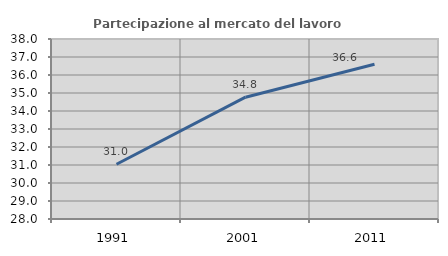
| Category | Partecipazione al mercato del lavoro  femminile |
|---|---|
| 1991.0 | 31.04 |
| 2001.0 | 34.768 |
| 2011.0 | 36.599 |